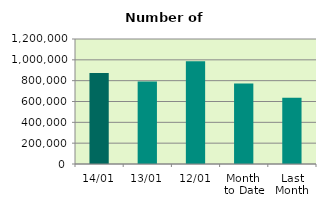
| Category | Series 0 |
|---|---|
| 14/01 | 872480 |
| 13/01 | 791380 |
| 12/01 | 986046 |
| Month 
to Date | 771983 |
| Last
Month | 635205.478 |